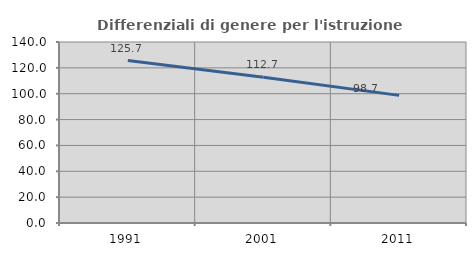
| Category | Differenziali di genere per l'istruzione superiore |
|---|---|
| 1991.0 | 125.669 |
| 2001.0 | 112.693 |
| 2011.0 | 98.715 |